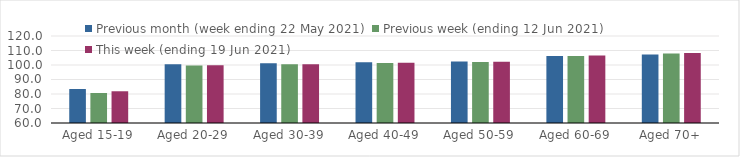
| Category | Previous month (week ending 22 May 2021) | Previous week (ending 12 Jun 2021) | This week (ending 19 Jun 2021) |
|---|---|---|---|
| Aged 15-19 | 83.43 | 80.7 | 81.89 |
| Aged 20-29 | 100.46 | 99.74 | 99.79 |
| Aged 30-39 | 101.13 | 100.59 | 100.56 |
| Aged 40-49 | 101.84 | 101.36 | 101.55 |
| Aged 50-59 | 102.46 | 102.02 | 102.23 |
| Aged 60-69 | 106.24 | 106.27 | 106.59 |
| Aged 70+ | 107.26 | 107.97 | 108.29 |